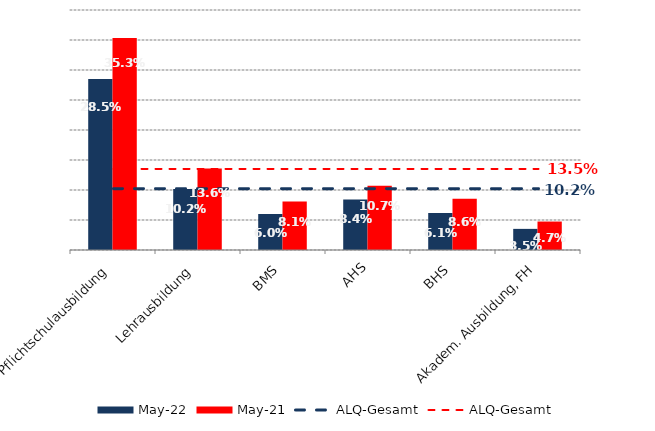
| Category | Mai 22 | Mai 21 |
|---|---|---|
| Pflichtschulausbildung | 0.285 | 0.353 |
| Lehrausbildung | 0.102 | 0.136 |
| BMS | 0.06 | 0.081 |
| AHS | 0.084 | 0.107 |
| BHS | 0.061 | 0.086 |
| Akadem. Ausbildung, FH | 0.035 | 0.047 |